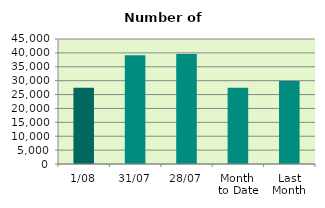
| Category | Series 0 |
|---|---|
| 1/08 | 27440 |
| 31/07 | 39154 |
| 28/07 | 39624 |
| Month 
to Date | 27440 |
| Last
Month | 29864.476 |